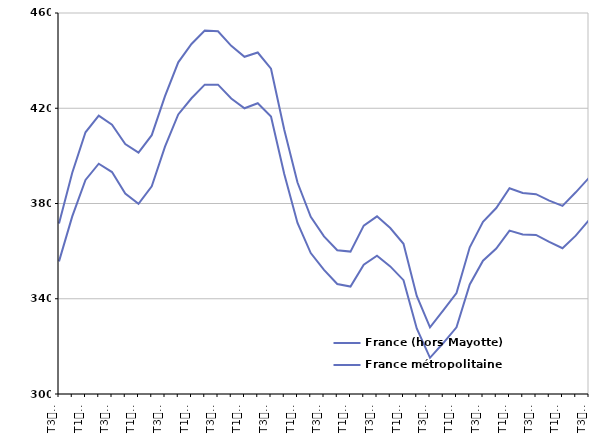
| Category | France (hors Mayotte) | France métropolitaine |
|---|---|---|
| T3
2013 | 371.6 | 355.7 |
| T4
2013 | 392.9 | 374.6 |
| T1
2014 | 409.9 | 389.9 |
| T2
2014 | 416.9 | 396.7 |
| T3
2014 | 413.1 | 393.2 |
| T4
2014 | 405 | 384.2 |
| T1
2015 | 401.4 | 379.9 |
| T2
2015 | 408.7 | 387.2 |
| T3
2015 | 425.1 | 403.9 |
| T4
2015 | 439.3 | 417.4 |
| T1
2016 | 447 | 424.2 |
| T2
2016 | 452.6 | 429.9 |
| T3
2016 | 452.3 | 429.9 |
| T4
2016 | 446.2 | 424.1 |
| T1
2017 | 441.6 | 420 |
| T2
2017 | 443.4 | 422.1 |
| T3
2017 | 436.6 | 416.5 |
| T4
2017 | 411 | 392.4 |
| T1
2018 | 388.8 | 371.8 |
| T2
2018 | 374.4 | 359.2 |
| T3
2018 | 366.2 | 352.1 |
| T4
2018 | 360.4 | 346.2 |
| T1
2019 | 359.8 | 345.1 |
| T2
2019 | 370.7 | 354.3 |
| T3
2019 | 374.6 | 358.1 |
| T4
2019 | 369.7 | 353.6 |
| T1
2020 | 363.1 | 347.8 |
| T2
2020 | 341.2 | 327.5 |
| T3
2020 | 328 | 315.2 |
| T4
2020 | 335.1 | 321.4 |
| T1
2021 | 342.4 | 328 |
| T2
2021 | 361.6 | 346 |
| T3
2021 | 372.3 | 356 |
| T4
2021 | 378.1 | 361.1 |
| T1
2022 | 386.4 | 368.6 |
| T2
2022 | 384.4 | 367 |
| T3
2022 | 383.9 | 366.8 |
| T4
2022 | 381.2 | 363.9 |
| T1
2023 | 379 | 361.2 |
| T2
2023 | 384.7 | 366.5 |
| T3
2023 | 390.8 | 373 |